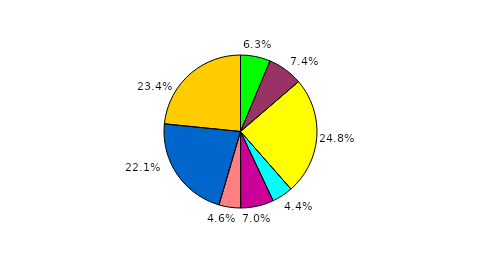
| Category | Series 0 |
|---|---|
| 0 | 6.304 |
| 1 | 7.399 |
| 2 | 24.84 |
| 3 | 4.446 |
| 4 | 6.967 |
| 5 | 4.59 |
| 6 | 22.053 |
| 7 | 23.402 |